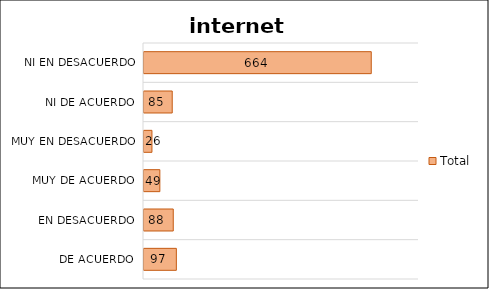
| Category | Total |
|---|---|
| De acuerdo | 97 |
| En desacuerdo | 88 |
| Muy de Acuerdo | 49 |
| Muy en desacuerdo | 26 |
| Ni de acuerdo, ni en desacuerdo | 85 |
| No responde | 664 |